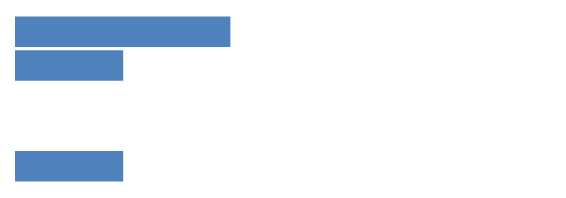
| Category | Series 0 |
|---|---|
| 0 | 2 |
| 1 | 1 |
| 2 | 0 |
| 3 | 0 |
| 4 | 1 |